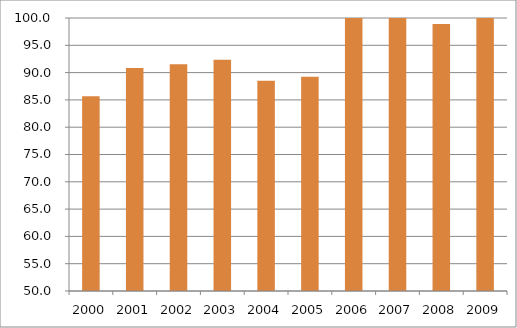
| Category | Região Nordeste |
|---|---|
| 2000.0 | 85.68 |
| 2001.0 | 90.86 |
| 2002.0 | 91.55 |
| 2003.0 | 92.35 |
| 2004.0 | 88.51 |
| 2005.0 | 89.24 |
| 2006.0 | 100.11 |
| 2007.0 | 102.18 |
| 2008.0 | 98.92 |
| 2009.0 | 100.16 |